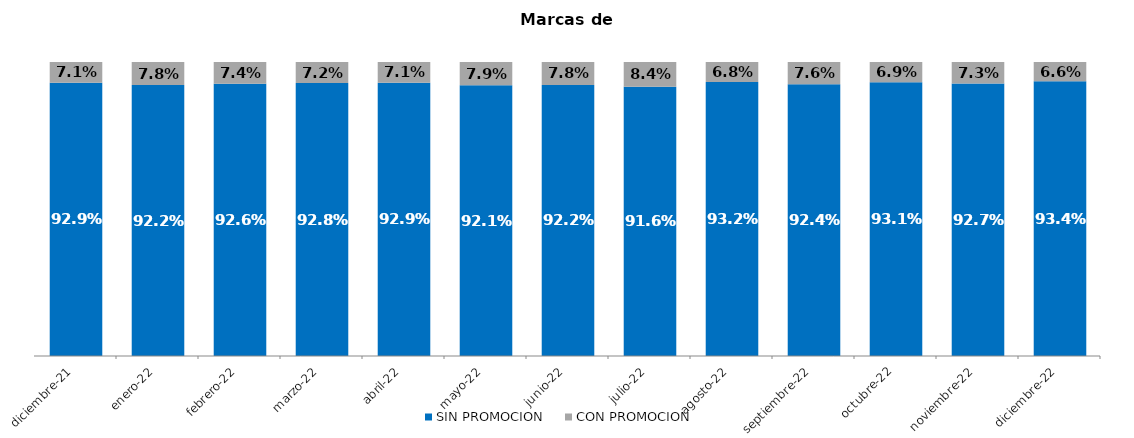
| Category | SIN PROMOCION   | CON PROMOCION   |
|---|---|---|
| 2021-12-01 | 0.929 | 0.071 |
| 2022-01-01 | 0.922 | 0.078 |
| 2022-02-01 | 0.926 | 0.074 |
| 2022-03-01 | 0.928 | 0.072 |
| 2022-04-01 | 0.929 | 0.071 |
| 2022-05-01 | 0.921 | 0.079 |
| 2022-06-01 | 0.922 | 0.078 |
| 2022-07-01 | 0.916 | 0.084 |
| 2022-08-01 | 0.932 | 0.068 |
| 2022-09-01 | 0.924 | 0.076 |
| 2022-10-01 | 0.931 | 0.069 |
| 2022-11-01 | 0.927 | 0.073 |
| 2022-12-01 | 0.934 | 0.066 |